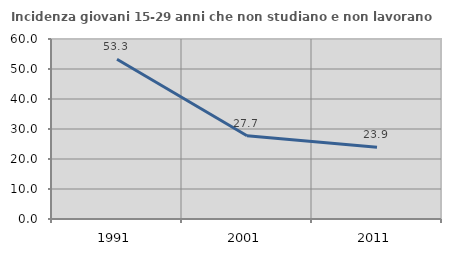
| Category | Incidenza giovani 15-29 anni che non studiano e non lavorano  |
|---|---|
| 1991.0 | 53.271 |
| 2001.0 | 27.731 |
| 2011.0 | 23.936 |